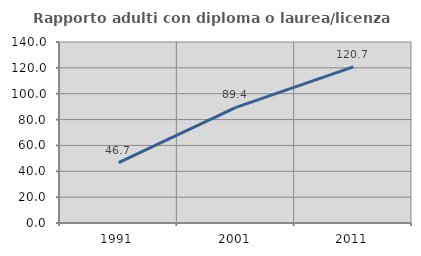
| Category | Rapporto adulti con diploma o laurea/licenza media  |
|---|---|
| 1991.0 | 46.723 |
| 2001.0 | 89.42 |
| 2011.0 | 120.746 |